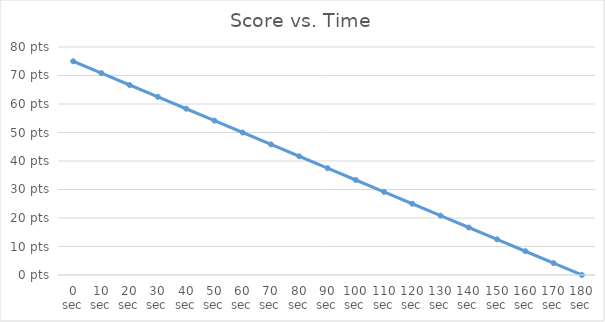
| Category | Score |
|---|---|
| 0.0 | 75 |
| 10.0 | 70.833 |
| 20.0 | 66.667 |
| 30.0 | 62.5 |
| 40.0 | 58.333 |
| 50.0 | 54.167 |
| 60.0 | 50 |
| 70.0 | 45.833 |
| 80.0 | 41.667 |
| 90.0 | 37.5 |
| 100.0 | 33.333 |
| 110.0 | 29.167 |
| 120.0 | 25 |
| 130.0 | 20.833 |
| 140.0 | 16.667 |
| 150.0 | 12.5 |
| 160.0 | 8.333 |
| 170.0 | 4.167 |
| 180.0 | 0 |